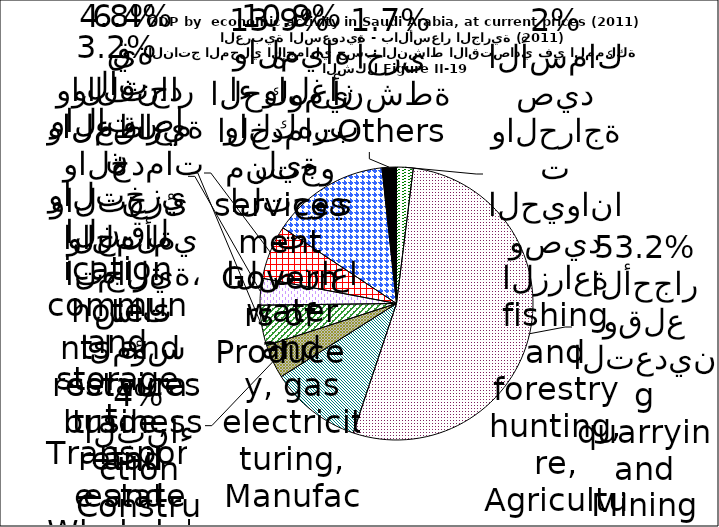
| Category | Series 0 |
|---|---|
| Agriculture, hunting, forestry and fishing | 0.02 |
| Mining and quarrying | 0.532 |
| Manufacturing, electricity, gas and water | 0.109 |
| Construction | 0.04 |
| Wholesale and retail trade, restaurants and hotels | 0.048 |
| Transport, storage and communication | 0.032 |
| Financial institutions, insurance, real estate and business services | 0.064 |
| Producers of government services | 0.139 |
| Others | 0.017 |